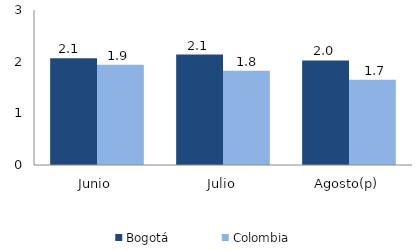
| Category | Bogotá | Colombia |
|---|---|---|
| Junio | 2.068 | 1.94 |
| Julio | 2.138 | 1.826 |
| Agosto(p) | 2.024 | 1.652 |